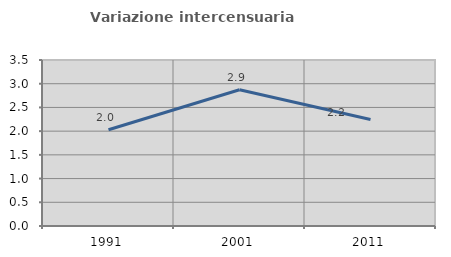
| Category | Variazione intercensuaria annua |
|---|---|
| 1991.0 | 2.03 |
| 2001.0 | 2.873 |
| 2011.0 | 2.245 |